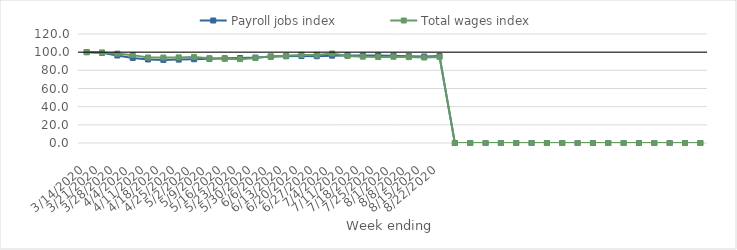
| Category | Payroll jobs index | Total wages index |
|---|---|---|
| 14/03/2020 | 100 | 100 |
| 21/03/2020 | 99.297 | 99.676 |
| 28/03/2020 | 96.353 | 98.41 |
| 04/04/2020 | 93.695 | 96.734 |
| 11/04/2020 | 91.951 | 94.156 |
| 18/04/2020 | 91.482 | 94.08 |
| 25/04/2020 | 91.798 | 94.248 |
| 02/05/2020 | 92.191 | 94.724 |
| 09/05/2020 | 92.737 | 93.356 |
| 16/05/2020 | 93.262 | 92.686 |
| 23/05/2020 | 93.563 | 92.308 |
| 30/05/2020 | 94.077 | 93.6 |
| 06/06/2020 | 95.016 | 95.393 |
| 13/06/2020 | 95.489 | 96.094 |
| 20/06/2020 | 95.696 | 96.969 |
| 27/06/2020 | 95.581 | 96.996 |
| 04/07/2020 | 96.174 | 98.514 |
| 11/07/2020 | 96.395 | 95.769 |
| 18/07/2020 | 96.226 | 95.048 |
| 25/07/2020 | 96.271 | 94.643 |
| 01/08/2020 | 96.155 | 94.947 |
| 08/08/2020 | 95.543 | 94.567 |
| 15/08/2020 | 95.204 | 94.097 |
| 22/08/2020 | 95.812 | 94.778 |